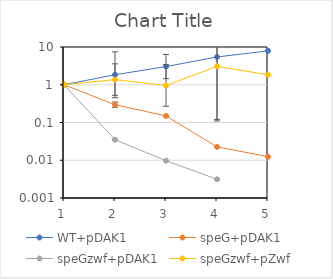
| Category | WT+pDAK1 | speG+pDAK1 | speGzwf+pDAK1 | speGzwf+pZwf |
|---|---|---|---|---|
| 0 | 1 | 1 | 1 | 1 |
| 1 | 1.839 | 0.296 | 0.035 | 1.371 |
| 2 | 3.033 | 0.149 | 0.01 | 0.959 |
| 3 | 5.447 | 0.023 | 0.003 | 3.074 |
| 4 | 7.902 | 0.012 | 0 | 1.84 |